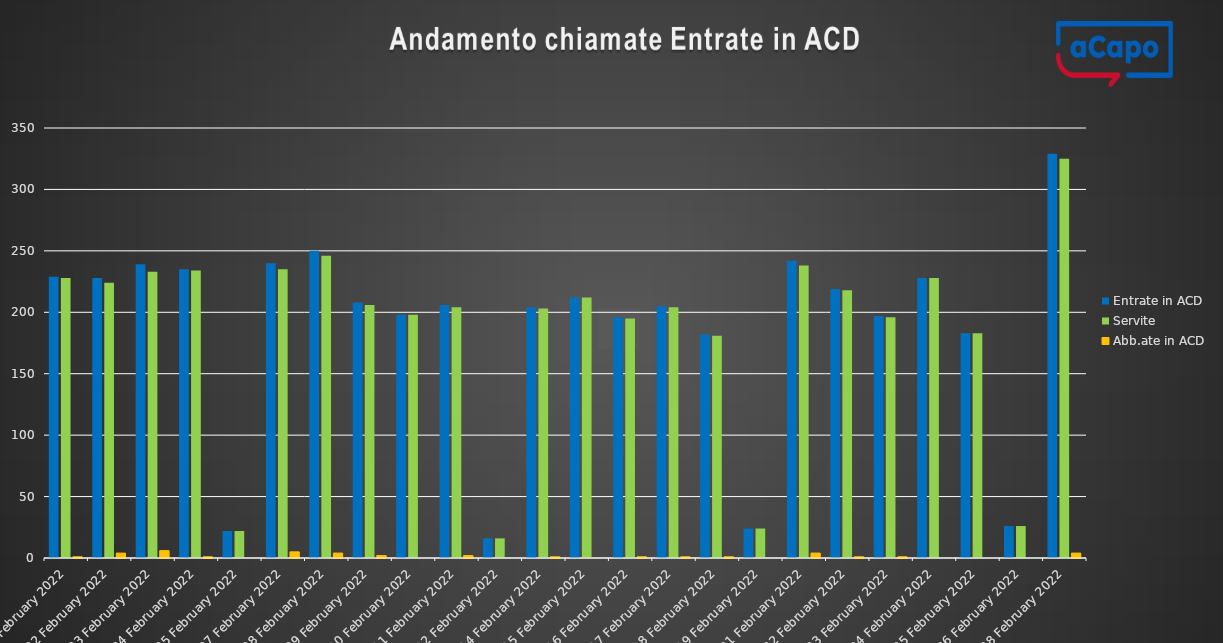
| Category | Entrate in ACD | Servite | Abb.ate in ACD |
|---|---|---|---|
| 2022-02-01 | 229 | 228 | 1 |
| 2022-02-02 | 228 | 224 | 4 |
| 2022-02-03 | 239 | 233 | 6 |
| 2022-02-04 | 235 | 234 | 1 |
| 2022-02-05 | 22 | 22 | 0 |
| 2022-02-07 | 240 | 235 | 5 |
| 2022-02-08 | 250 | 246 | 4 |
| 2022-02-09 | 208 | 206 | 2 |
| 2022-02-10 | 198 | 198 | 0 |
| 2022-02-11 | 206 | 204 | 2 |
| 2022-02-12 | 16 | 16 | 0 |
| 2022-02-14 | 204 | 203 | 1 |
| 2022-02-15 | 212 | 212 | 0 |
| 2022-02-16 | 196 | 195 | 1 |
| 2022-02-17 | 205 | 204 | 1 |
| 2022-02-18 | 182 | 181 | 1 |
| 2022-02-19 | 24 | 24 | 0 |
| 2022-02-21 | 242 | 238 | 4 |
| 2022-02-22 | 219 | 218 | 1 |
| 2022-02-23 | 197 | 196 | 1 |
| 2022-02-24 | 228 | 228 | 0 |
| 2022-02-25 | 183 | 183 | 0 |
| 2022-02-26 | 26 | 26 | 0 |
| 2022-02-28 | 329 | 325 | 4 |